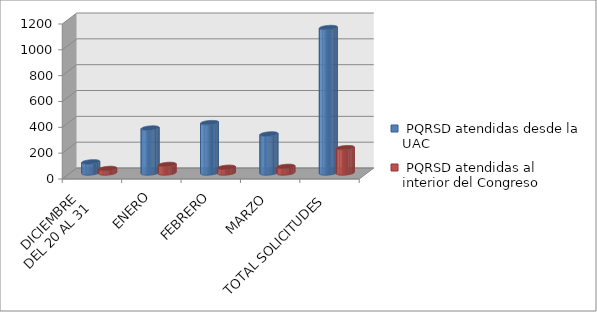
| Category |  PQRSD atendidas desde la UAC |  PQRSD atendidas al interior del Congreso |
|---|---|---|
| DICIEMBRE 
DEL 20 AL 31 | 86 | 35 |
| ENERO | 348 | 66 |
| FEBRERO | 390 | 44 |
| MARZO | 302 | 51 |
| TOTAL SOLICITUDES | 1126 | 196 |